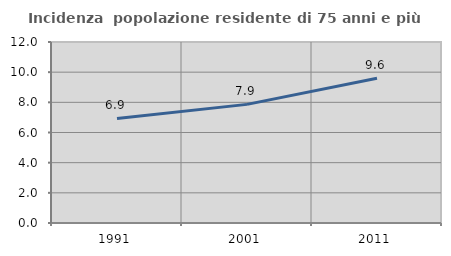
| Category | Incidenza  popolazione residente di 75 anni e più |
|---|---|
| 1991.0 | 6.936 |
| 2001.0 | 7.865 |
| 2011.0 | 9.597 |